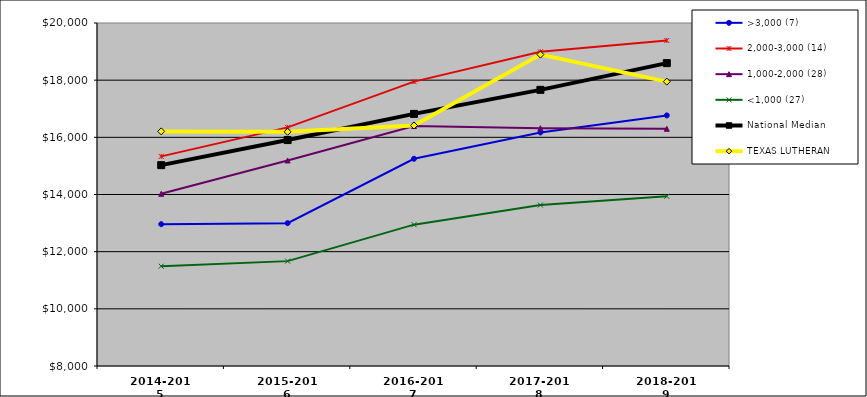
| Category | >3,000 (7) | 2,000-3,000 (14) | 1,000-2,000 (28) | <1,000 (27) | National Median | TEXAS LUTHERAN |
|---|---|---|---|---|---|---|
| 2014-2015 | 12962 | 15333 | 14024 | 11491 | 15026.5 | 16208 |
| 2015-2016 | 12997 | 16347.5 | 15190.5 | 11669 | 15904.5 | 16193 |
| 2016-2017 | 15251 | 17948.5 | 16395.5 | 12945 | 16820.5 | 16415 |
| 2017-2018 | 16171 | 18990.5 | 16318 | 13632 | 17661 | 18895 |
| 2018-2019 | 16766 | 19387.5 | 16298.5 | 13937 | 18596 | 17949 |